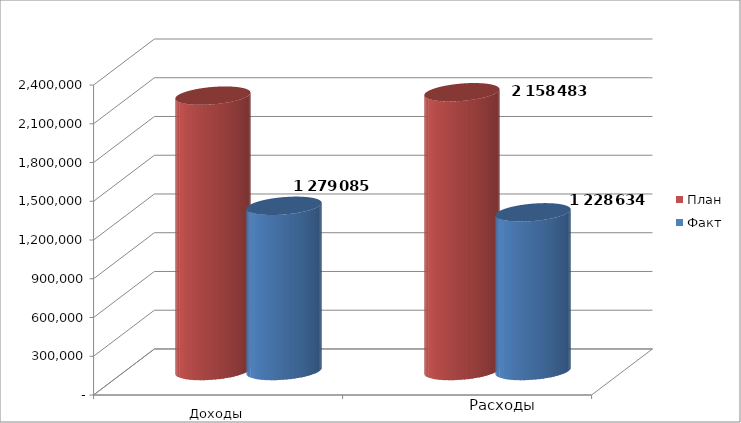
| Category | План | Факт |
|---|---|---|
| 0 | 2132078 | 1279085 |
| 1 | 2158483 | 1228633.5 |